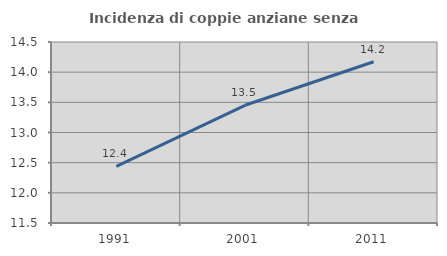
| Category | Incidenza di coppie anziane senza figli  |
|---|---|
| 1991.0 | 12.44 |
| 2001.0 | 13.451 |
| 2011.0 | 14.172 |